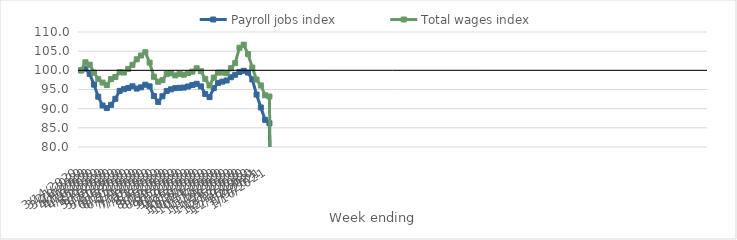
| Category | Payroll jobs index | Total wages index |
|---|---|---|
| 14/03/2020 | 100 | 100 |
| 21/03/2020 | 100.444 | 102.096 |
| 28/03/2020 | 99.076 | 101.482 |
| 04/04/2020 | 96.274 | 99.407 |
| 11/04/2020 | 93.128 | 97.694 |
| 18/04/2020 | 90.824 | 96.81 |
| 25/04/2020 | 90.157 | 96.15 |
| 02/05/2020 | 90.997 | 97.723 |
| 09/05/2020 | 92.571 | 98.268 |
| 16/05/2020 | 94.643 | 99.508 |
| 23/05/2020 | 95.083 | 99.43 |
| 30/05/2020 | 95.395 | 100.374 |
| 06/06/2020 | 95.838 | 101.431 |
| 13/06/2020 | 95.238 | 102.875 |
| 20/06/2020 | 95.56 | 103.867 |
| 27/06/2020 | 96.248 | 104.715 |
| 04/07/2020 | 95.824 | 102.004 |
| 11/07/2020 | 93.299 | 98.329 |
| 18/07/2020 | 91.757 | 97.017 |
| 25/07/2020 | 93.241 | 97.43 |
| 01/08/2020 | 94.631 | 99.016 |
| 08/08/2020 | 95.048 | 99.244 |
| 15/08/2020 | 95.36 | 98.675 |
| 22/08/2020 | 95.439 | 99.07 |
| 29/08/2020 | 95.5 | 98.855 |
| 05/09/2020 | 95.783 | 99.304 |
| 12/09/2020 | 96.164 | 99.662 |
| 19/09/2020 | 96.488 | 100.528 |
| 26/09/2020 | 95.816 | 99.777 |
| 03/10/2020 | 93.85 | 97.773 |
| 10/10/2020 | 93.015 | 96.049 |
| 17/10/2020 | 95.345 | 98.097 |
| 24/10/2020 | 96.72 | 99.398 |
| 31/10/2020 | 97.051 | 99.425 |
| 07/11/2020 | 97.351 | 99.256 |
| 14/11/2020 | 98.202 | 100.543 |
| 21/11/2020 | 98.836 | 101.875 |
| 28/11/2020 | 99.575 | 105.893 |
| 05/12/2020 | 99.877 | 106.697 |
| 12/12/2020 | 99.415 | 104.232 |
| 19/12/2020 | 97.631 | 100.724 |
| 26/12/2020 | 93.677 | 97.583 |
| 02/01/2021 | 90.314 | 96.062 |
| 09/01/2021 | 87.082 | 93.496 |
| 16/01/2021 | 86.182 | 93.171 |